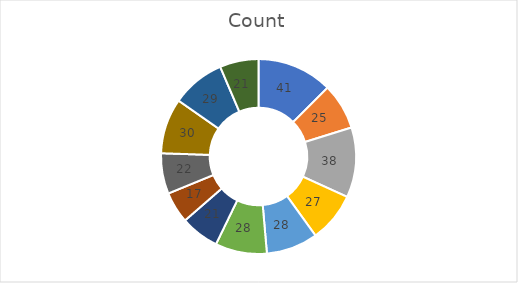
| Category | Count |
|---|---|
| Fully remote learning opportunities for students that requested it | 41 |
| Hybrid learning opportunities | 25 |
| In-person learning opportunities | 38 |
| Increased counseling and/or social-emotional support to students compared to prior years | 27 |
| Increased family-engagement services compared to prior years | 28 |
| In-person educational services targeted to students with disabilities | 28 |
| In-person educational services targeted to English Language Learners | 21 |
| In-person educational services targeted to other special student populations such as students eligible for free or reduced lunch, minority students, ELL students, etc. (please describe in comments) | 17 |
| Use of a targeted social emotional learning curriculum | 22 |
| Access to free/low-cost internet or internet capable devices to families requesting such tools | 30 |
| Use of a centralized learning management service platform to deliver remote learning | 29 |
| Professional development for educators on delivering high quality remote learning opportunities to students | 21 |